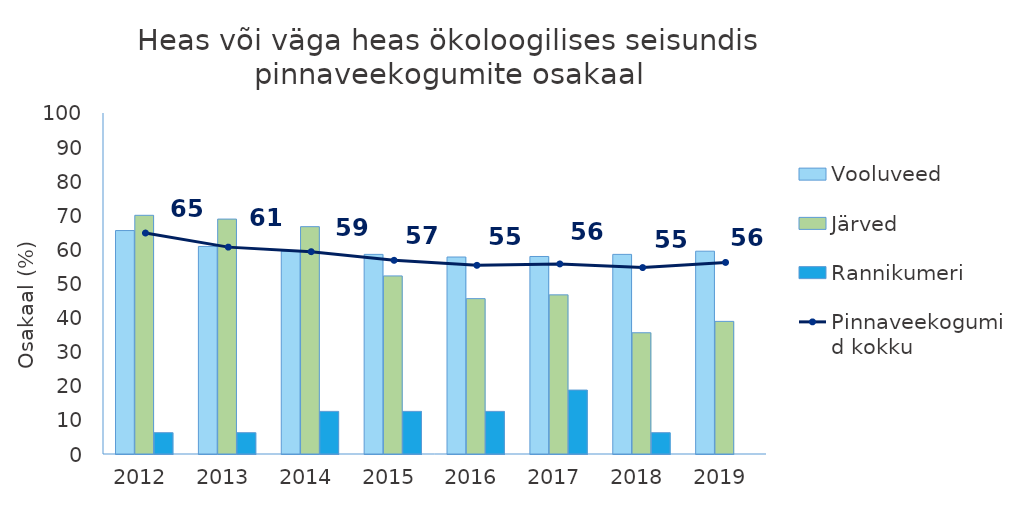
| Category | Vooluveed | Järved | Rannikumeri |
|---|---|---|---|
| 2012.0 | 65.528 | 70 | 6.25 |
| 2013.0 | 60.87 | 68.889 | 6.25 |
| 2014.0 | 59.472 | 66.667 | 12.5 |
| 2015.0 | 58.54 | 52.222 | 12.5 |
| 2016.0 | 57.764 | 45.556 | 12.5 |
| 2017.0 | 57.919 | 46.667 | 18.75 |
| 2018.0 | 58.54 | 35.556 | 6.25 |
| 2019.0 | 59.472 | 38.889 | 0 |